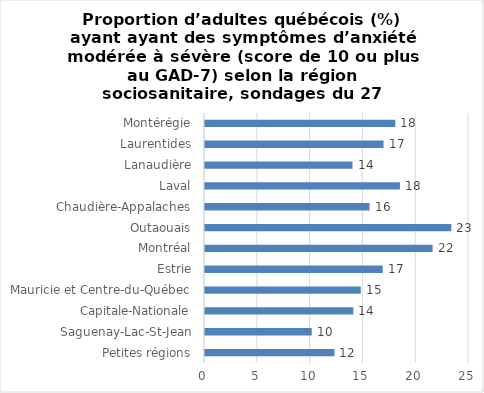
| Category | % |
|---|---|
| Petites régions | 12.253 |
| Saguenay-Lac-St-Jean | 10.104 |
| Capitale-Nationale | 14.042 |
| Mauricie et Centre-du-Québec | 14.749 |
| Estrie | 16.836 |
| Montréal | 21.557 |
| Outaouais | 23.327 |
| Chaudière-Appalaches | 15.587 |
| Laval | 18.46 |
| Lanaudière | 13.968 |
| Laurentides | 16.906 |
| Montérégie | 18.019 |